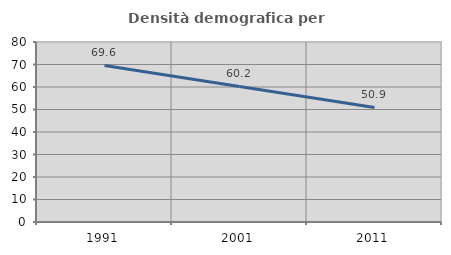
| Category | Densità demografica |
|---|---|
| 1991.0 | 69.565 |
| 2001.0 | 60.25 |
| 2011.0 | 50.934 |